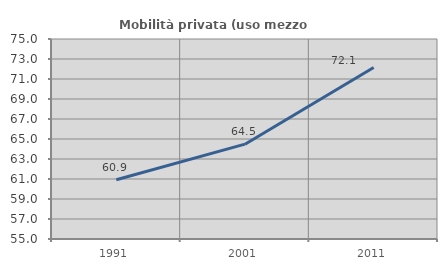
| Category | Mobilità privata (uso mezzo privato) |
|---|---|
| 1991.0 | 60.924 |
| 2001.0 | 64.483 |
| 2011.0 | 72.145 |